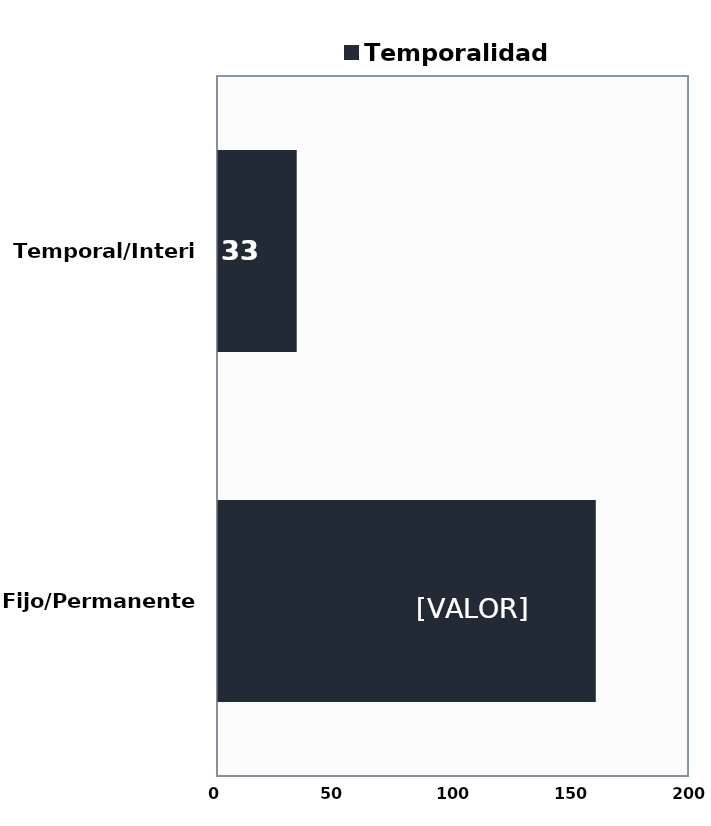
| Category | Temporalidad |
|---|---|
| Fijo/Permanente | 160 |
| Temporal/Interino | 33 |